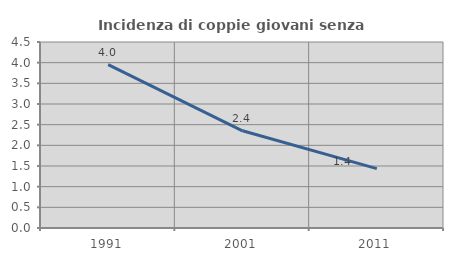
| Category | Incidenza di coppie giovani senza figli |
|---|---|
| 1991.0 | 3.954 |
| 2001.0 | 2.352 |
| 2011.0 | 1.436 |